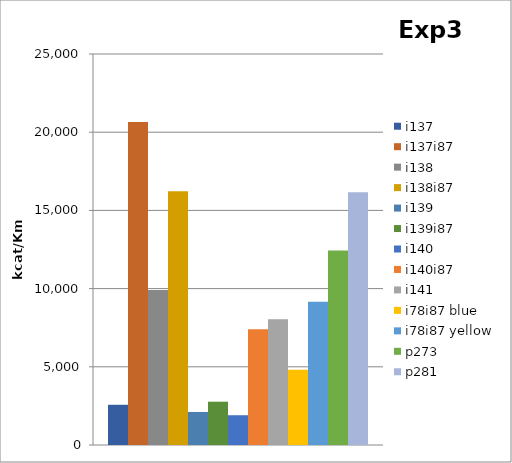
| Category | i137 | i137i87 | i138 | i138i87 | i139 | i139i87 | i140 | i140i87 | i141 | i78i87 blue | i78i87 yellow | p273 | p281 |
|---|---|---|---|---|---|---|---|---|---|---|---|---|---|
| 0 | 2572.714 | 20650 | 9904.762 | 16227.778 | 2112.264 | 2768.75 | 1903.469 | 7403.571 | 8035 | 4807.292 | 9164.773 | 12435.185 | 16155.556 |